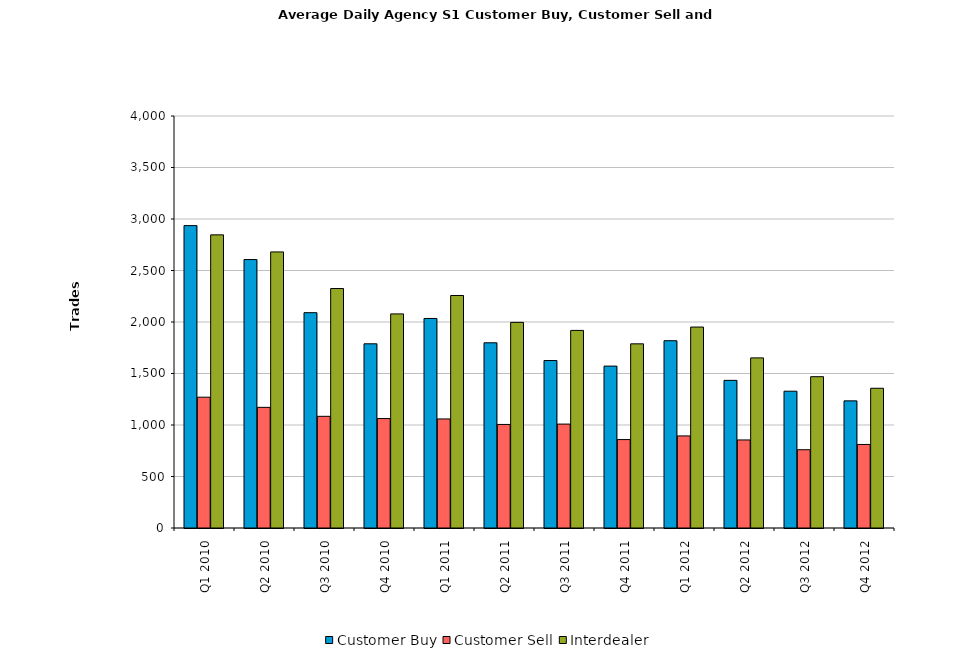
| Category | Customer Buy | Customer Sell | Interdealer |
|---|---|---|---|
| Q1 2010 | 2935.739 | 1270 | 2845.957 |
| Q2 2010 | 2606.111 | 1171.286 | 2680.349 |
| Q3 2010 | 2090.5 | 1084.203 | 2324.938 |
| Q4 2010 | 1788.234 | 1062.766 | 2078.609 |
| Q1 2011 | 2034.387 | 1058.839 | 2257.29 |
| Q2 2011 | 1798.238 | 1005.46 | 1996.54 |
| Q3 2011 | 1625.875 | 1008.922 | 1918.328 |
| Q4 2011 | 1571.873 | 858.524 | 1788.048 |
| Q1 2012 | 1818.403 | 893.984 | 1950.984 |
| Q2 2012 | 1433.317 | 854.921 | 1651.683 |
| Q3 2012 | 1328.175 | 759.905 | 1468.937 |
| Q4 2012 | 1234.317 | 811.079 | 1356.746 |